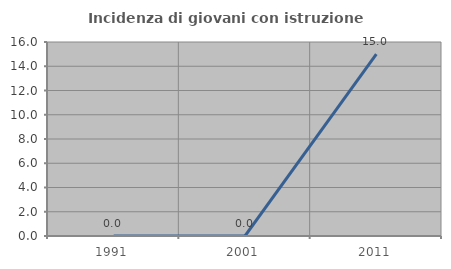
| Category | Incidenza di giovani con istruzione universitaria |
|---|---|
| 1991.0 | 0 |
| 2001.0 | 0 |
| 2011.0 | 15 |